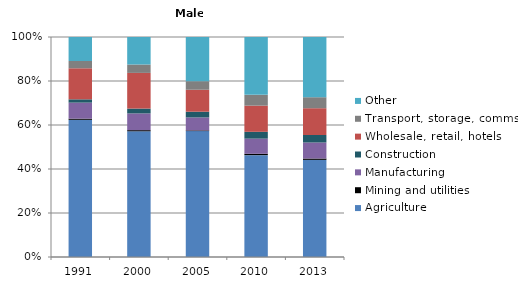
| Category | Agriculture | Mining and utilities | Manufacturing | Construction | Wholesale, retail, hotels | Transport, storage, comms | Other |
|---|---|---|---|---|---|---|---|
| 1991.0 | 62.3 | 0.5 | 7.3 | 1.5 | 14.1 | 3.3 | 10.9 |
| 2000.0 | 57.1 | 0.5 | 7.6 | 2.2 | 16.2 | 3.8 | 12.5 |
| 2005.0 | 57.3 | 0.3 | 5.9 | 2.6 | 10 | 3.9 | 20.1 |
| 2010.0 | 46.3 | 0.6 | 6.9 | 3.1 | 11.9 | 4.9 | 26.3 |
| 2013.0 | 44.2 | 0.6 | 7.3 | 3.4 | 12.2 | 5 | 27.4 |